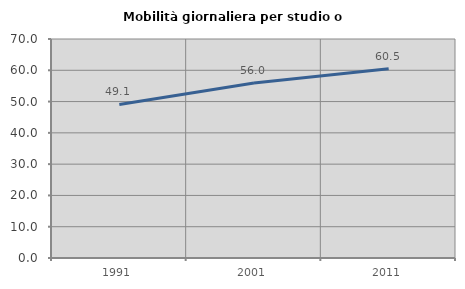
| Category | Mobilità giornaliera per studio o lavoro |
|---|---|
| 1991.0 | 49.087 |
| 2001.0 | 55.958 |
| 2011.0 | 60.483 |